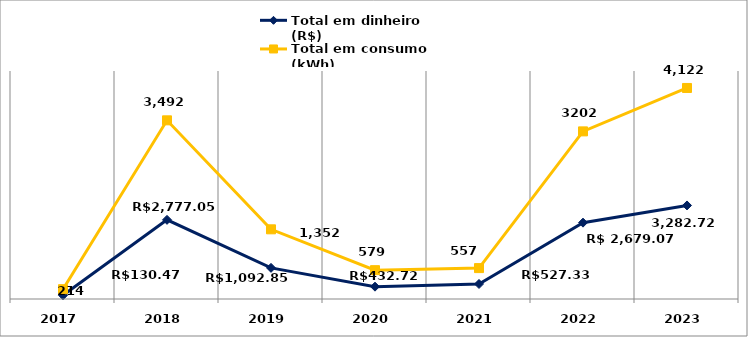
| Category | Total em dinheiro (R$) | Total em consumo (kWh) |
|---|---|---|
| 2017.0 | 130.47 | 214 |
| 2018.0 | 2777.05 | 3492 |
| 2019.0 | 1092.85 | 1352 |
| 2020.0 | 432.72 | 579 |
| 2021.0 | 527.33 | 557 |
| 2022.0 | 2679.07 | 3202 |
| 2023.0 | 3282.72 | 4122 |